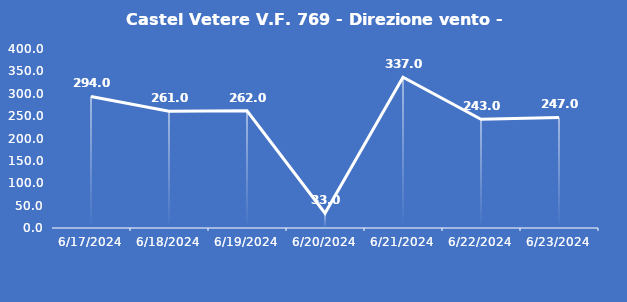
| Category | Castel Vetere V.F. 769 - Direzione vento - Grezzo (°N) |
|---|---|
| 6/17/24 | 294 |
| 6/18/24 | 261 |
| 6/19/24 | 262 |
| 6/20/24 | 33 |
| 6/21/24 | 337 |
| 6/22/24 | 243 |
| 6/23/24 | 247 |